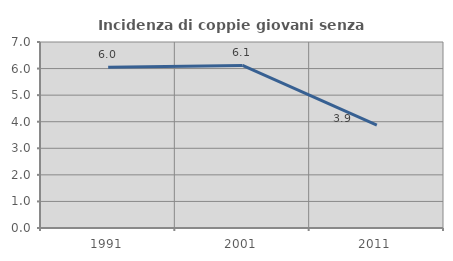
| Category | Incidenza di coppie giovani senza figli |
|---|---|
| 1991.0 | 6.047 |
| 2001.0 | 6.117 |
| 2011.0 | 3.872 |